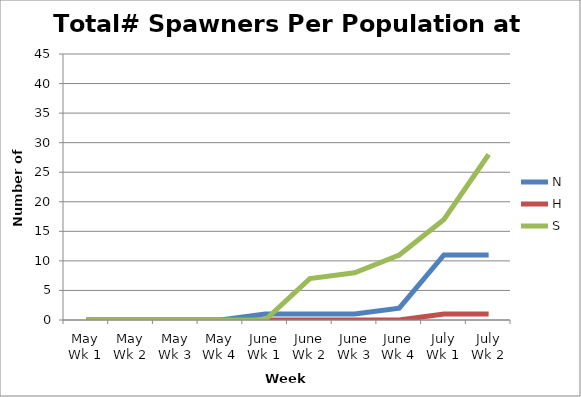
| Category | N | H | S |
|---|---|---|---|
| May Wk 1 | 0 | 0 | 0 |
| May Wk 2 | 0 | 0 | 0 |
| May Wk 3 | 0 | 0 | 0 |
| May Wk 4 | 0 | 0 | 0 |
| June Wk 1 | 1 | 0 | 0 |
| June Wk 2 | 1 | 0 | 7 |
| June Wk 3 | 1 | 0 | 8 |
| June Wk 4 | 2 | 0 | 11 |
| July Wk 1 | 11 | 1 | 17 |
| July Wk 2 | 11 | 1 | 28 |